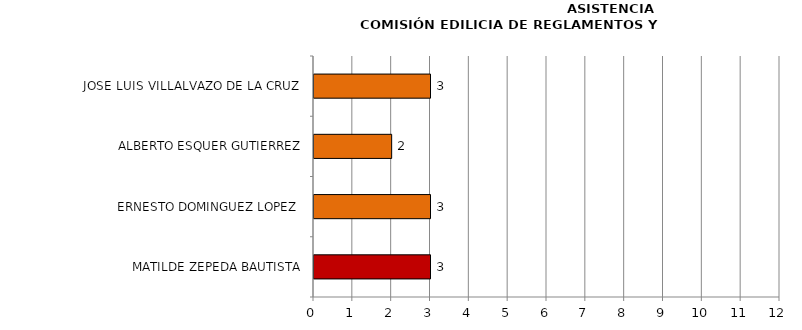
| Category | Series 0 |
|---|---|
| MATILDE ZEPEDA BAUTISTA | 3 |
| ERNESTO DOMINGUEZ LOPEZ  | 3 |
| ALBERTO ESQUER GUTIERREZ | 2 |
| JOSE LUIS VILLALVAZO DE LA CRUZ  | 3 |